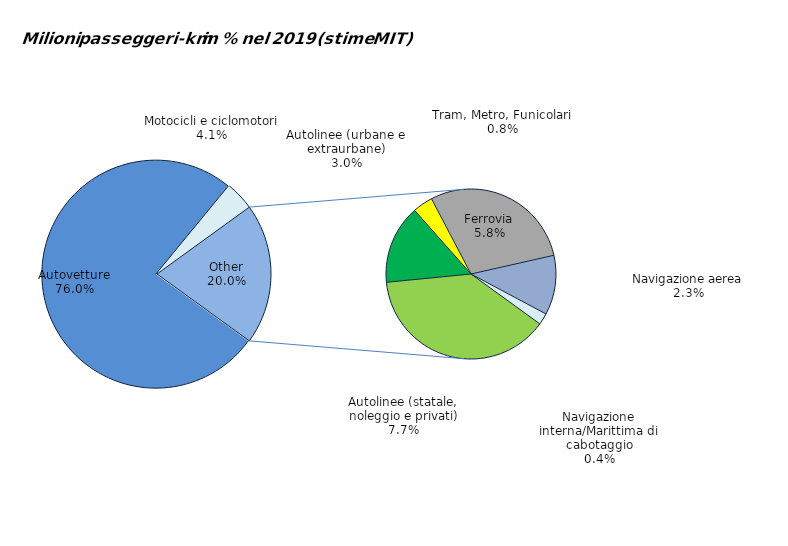
| Category | 2019 |
|---|---|
| Autovetture | 0.76 |
| Motocicli e ciclomotori | 0.041 |
| Autolinee (statale, noleggio e privati) | 0.077 |
| Autolinee (urbane e extraurbane) | 0.03 |
| Tram, Metro, Funicolari | 0.008 |
| Ferrovia | 0.058 |
| Navigazione aerea | 0.023 |
| Navigazione interna/Marittima di cabotaggio | 0.004 |